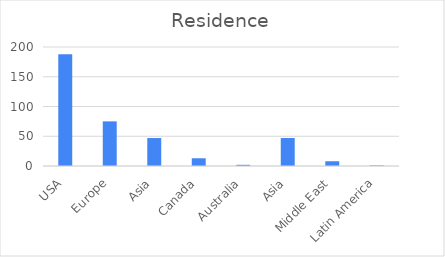
| Category | Series 0 |
|---|---|
| USA | 188 |
| Europe | 75 |
| Asia | 47 |
| Canada | 13 |
| Australia | 2 |
| Asia | 47 |
| Middle East | 8 |
| Latin America | 1 |